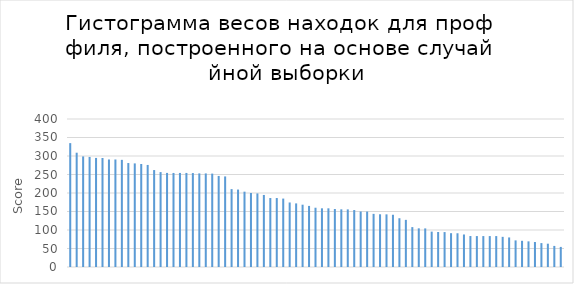
| Category | Series 0 |
|---|---|
| 0 | 334.8 |
| 1 | 308.9 |
| 2 | 298.9 |
| 3 | 297.5 |
| 4 | 294.8 |
| 5 | 294.6 |
| 6 | 290.6 |
| 7 | 290.6 |
| 8 | 289.6 |
| 9 | 281 |
| 10 | 280 |
| 11 | 278.4 |
| 12 | 275.8 |
| 13 | 262 |
| 14 | 256.5 |
| 15 | 254.3 |
| 16 | 254.2 |
| 17 | 254.2 |
| 18 | 254.2 |
| 19 | 253.9 |
| 20 | 253 |
| 21 | 252.9 |
| 22 | 252.4 |
| 23 | 246.1 |
| 24 | 244.8 |
| 25 | 210.5 |
| 26 | 209.3 |
| 27 | 203.6 |
| 28 | 200.1 |
| 29 | 198.9 |
| 30 | 194.7 |
| 31 | 186.4 |
| 32 | 186.4 |
| 33 | 184.9 |
| 34 | 174.4 |
| 35 | 171.9 |
| 36 | 168.4 |
| 37 | 165.1 |
| 38 | 160.2 |
| 39 | 158.6 |
| 40 | 158.6 |
| 41 | 156.8 |
| 42 | 155.9 |
| 43 | 155.7 |
| 44 | 153.9 |
| 45 | 150 |
| 46 | 149.8 |
| 47 | 143.6 |
| 48 | 142.5 |
| 49 | 142.3 |
| 50 | 141.2 |
| 51 | 131.8 |
| 52 | 127.4 |
| 53 | 107.8 |
| 54 | 104.5 |
| 55 | 104.3 |
| 56 | 95.6 |
| 57 | 94.6 |
| 58 | 94.4 |
| 59 | 91.4 |
| 60 | 91.2 |
| 61 | 87.9 |
| 62 | 83.7 |
| 63 | 83.6 |
| 64 | 83.6 |
| 65 | 83.6 |
| 66 | 83.6 |
| 67 | 81.5 |
| 68 | 79.9 |
| 69 | 71.9 |
| 70 | 70.8 |
| 71 | 69.3 |
| 72 | 67.5 |
| 73 | 64.6 |
| 74 | 63 |
| 75 | 57 |
| 76 | 54.3 |